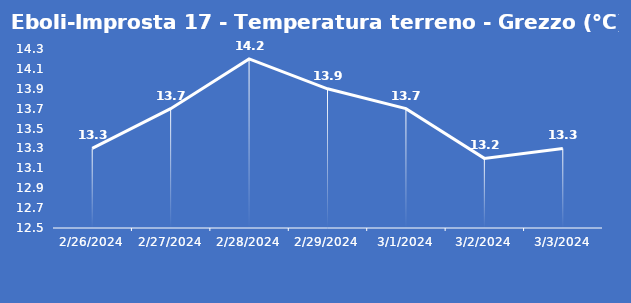
| Category | Eboli-Improsta 17 - Temperatura terreno - Grezzo (°C) |
|---|---|
| 2/26/24 | 13.3 |
| 2/27/24 | 13.7 |
| 2/28/24 | 14.2 |
| 2/29/24 | 13.9 |
| 3/1/24 | 13.7 |
| 3/2/24 | 13.2 |
| 3/3/24 | 13.3 |